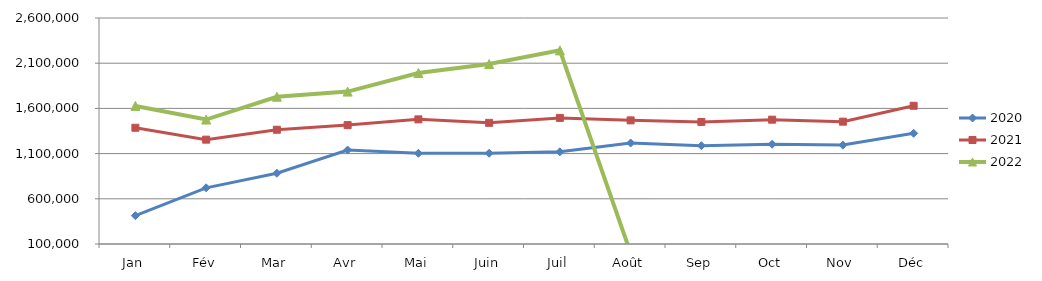
| Category | 2020 | 2021 | 2022 |
|---|---|---|---|
| Jan | 413718.973 | 1385841.188 | 1627456.472 |
| Fév | 721421.241 | 1254294.981 | 1476666.108 |
| Mar | 882604.122 | 1363936.74 | 1729038.394 |
| Avr | 1139215.204 | 1415132.587 | 1785767.247 |
| Mai | 1103343.599 | 1478708.989 | 1990940.17 |
| Juin | 1103576.761 | 1440368.873 | 2090704.381 |
| Juil | 1119722.736 | 1494841.171 | 2241856.118 |
| Août | 1217354.798 | 1467575.235 | 0 |
| Sep | 1187669.872 | 1450120.701 | 0 |
| Oct | 1203449.934 | 1475187.371 | 0 |
| Nov | 1194014.644 | 1453215.071 | 0 |
| Déc | 1324311.651 | 1629008.122 | 0 |